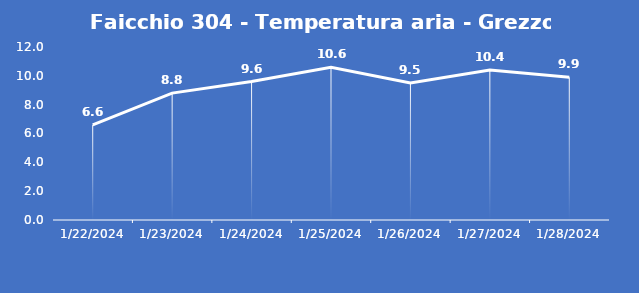
| Category | Faicchio 304 - Temperatura aria - Grezzo (°C) |
|---|---|
| 1/22/24 | 6.6 |
| 1/23/24 | 8.8 |
| 1/24/24 | 9.6 |
| 1/25/24 | 10.6 |
| 1/26/24 | 9.5 |
| 1/27/24 | 10.4 |
| 1/28/24 | 9.9 |